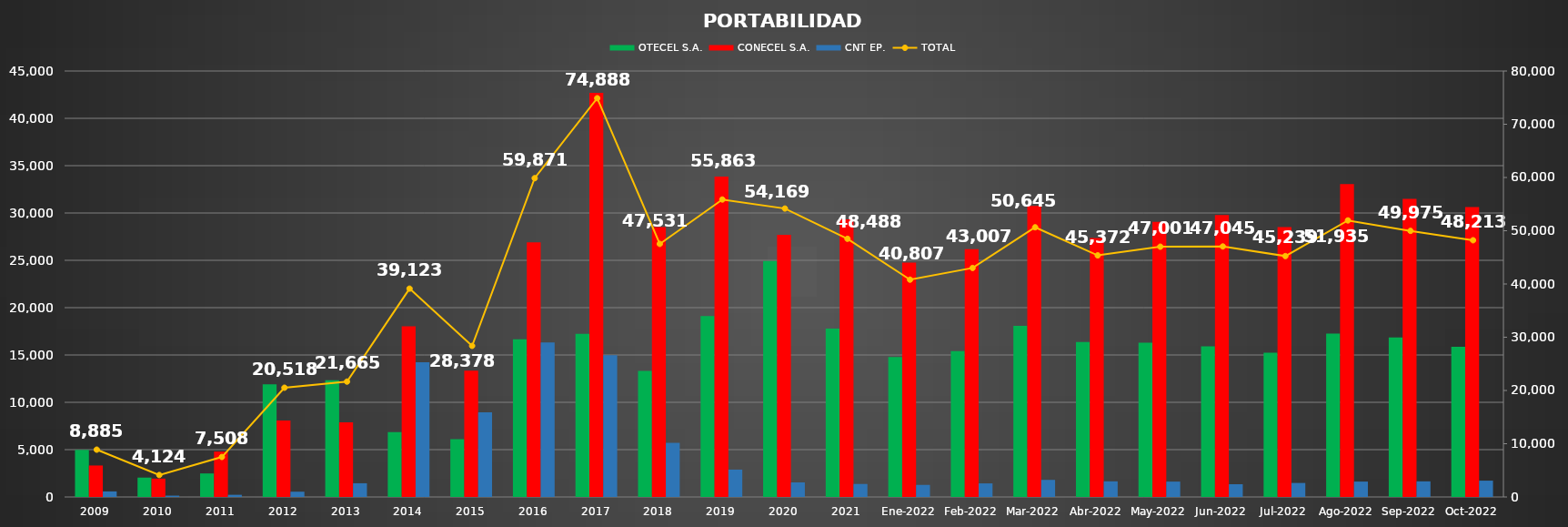
| Category | OTECEL S.A. | CONECEL S.A. | CNT EP. |
|---|---|---|---|
| 2009 | 4973 | 3324 | 588 |
| 2010 | 2045 | 1939 | 140 |
| 2011 | 2484 | 4796 | 228 |
| 2012 | 11894 | 8067 | 557 |
| 2013 | 12323 | 7893 | 1449 |
| 2014 | 6853 | 18039 | 14231 |
| 2015 | 6105 | 13334 | 8939 |
| 2016 | 16653 | 26907 | 16311 |
| 2017 | 17228 | 42694 | 14966 |
| 2018 | 13309 | 28504 | 5718 |
| 2019 | 19116 | 33857 | 2890 |
| 2020 | 24933 | 27700 | 1536 |
| 2021 | 17795 | 29321 | 1372 |
| Ene-2022 | 14781 | 24752 | 1274 |
| Feb-2022 | 15406 | 26168 | 1433 |
| Mar-2022 | 18084 | 30756 | 1805 |
| Abr-2022 | 16370 | 27352 | 1650 |
| May-2022 | 16305 | 29073 | 1623 |
| Jun-2022 | 15912 | 29786 | 1347 |
| Jul-2022 | 15250 | 28511 | 1478 |
| Ago-2022 | 17256 | 33054 | 1625 |
| Sep-2022 | 16844 | 31482 | 1649 |
| Oct-2022 | 15864 | 30626 | 1723 |